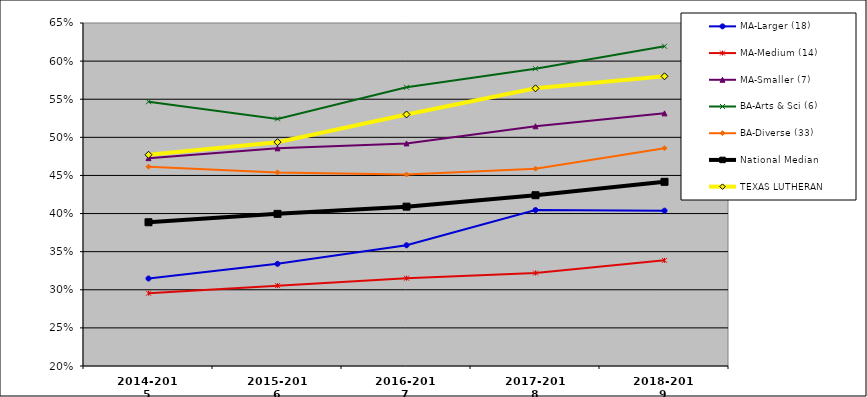
| Category | MA-Larger (18) | MA-Medium (14) | MA-Smaller (7) | BA-Arts & Sci (6) | BA-Diverse (33) | National Median | TEXAS LUTHERAN |
|---|---|---|---|---|---|---|---|
| 2014-2015 | 0.315 | 0.296 | 0.473 | 0.547 | 0.461 | 0.389 | 0.477 |
| 2015-2016 | 0.334 | 0.305 | 0.486 | 0.524 | 0.454 | 0.4 | 0.494 |
| 2016-2017 | 0.358 | 0.315 | 0.492 | 0.566 | 0.451 | 0.409 | 0.53 |
| 2017-2018 | 0.405 | 0.322 | 0.515 | 0.59 | 0.459 | 0.424 | 0.564 |
| 2018-2019 | 0.404 | 0.339 | 0.531 | 0.619 | 0.486 | 0.442 | 0.58 |